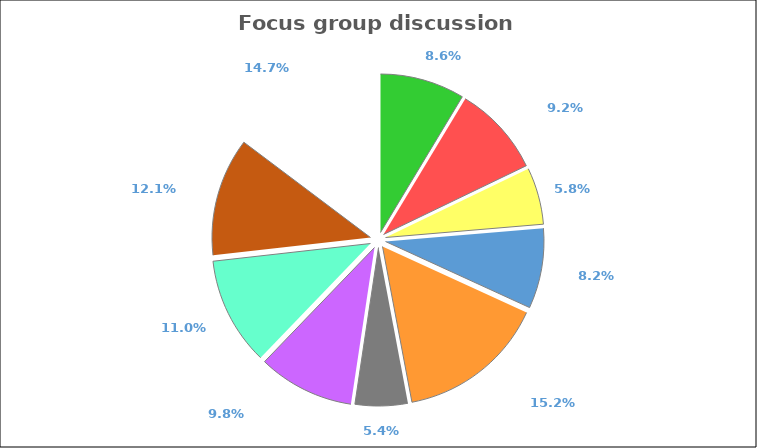
| Category | Series 0 |
|---|---|
| FINANCE | 0.086 |
| COMMUNICATION | 0.092 |
| LID | 0.058 |
| STORMWATER MANAGEMENT | 0.082 |
| PORIRUA/COMMUNITY | 0.152 |
| INFRASTRUCTURE | 0.054 |
| REGULATION/POLICY | 0.098 |
| PRIORITIES | 0.11 |
| DEVELOPMENT | 0.121 |
| OTHER | 0.147 |